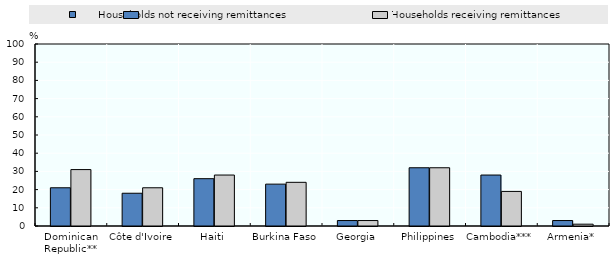
| Category |       Households not receiving remittances |   Households receiving remittances |
|---|---|---|
| Dominican Republic** | 21 | 31 |
| Côte d'Ivoire | 18 | 21 |
| Haiti | 26 | 28 |
| Burkina Faso | 23 | 24 |
| Georgia | 3 | 3 |
| Philippines | 32 | 32 |
| Cambodia*** | 28 | 19 |
| Armenia* | 3 | 1 |